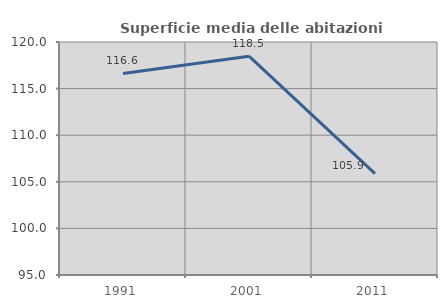
| Category | Superficie media delle abitazioni occupate |
|---|---|
| 1991.0 | 116.624 |
| 2001.0 | 118.475 |
| 2011.0 | 105.887 |